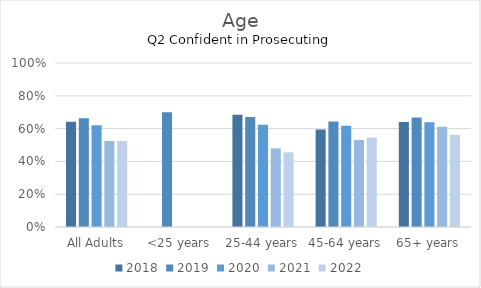
| Category | 2018 | 2019 | 2020 | 2021 | 2022 |
|---|---|---|---|---|---|
| All Adults | 0.642 | 0.663 | 0.621 | 0.525 | 0.524 |
| <25 years | 0 | 0.7 | 0 | 0 | 0 |
| 25-44 years | 0.684 | 0.671 | 0.623 | 0.48 | 0.455 |
| 45-64 years | 0.595 | 0.643 | 0.618 | 0.531 | 0.544 |
| 65+ years | 0.64 | 0.668 | 0.638 | 0.611 | 0.563 |